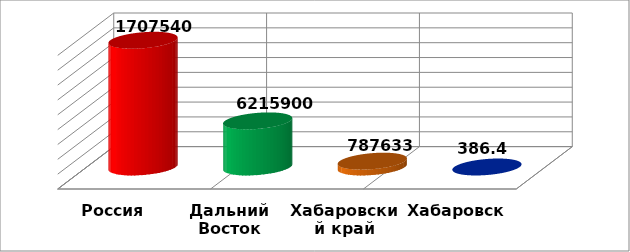
| Category | Series 0 |
|---|---|
| Россия | 17075400 |
| Дальний Восток | 6215900 |
| Хабаровский край | 787633 |
| Хабаровск | 386.4 |